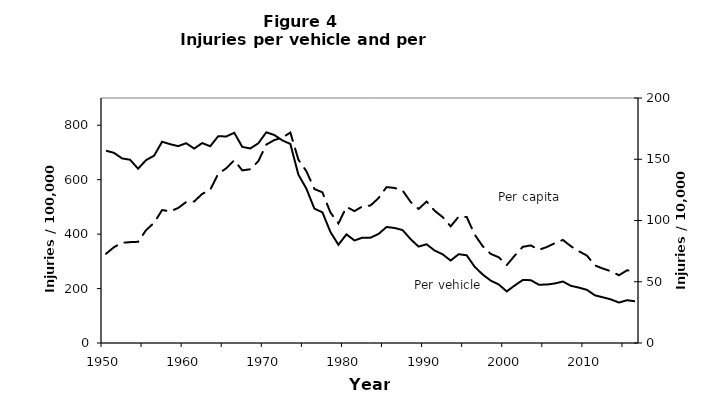
| Category | Series 0 |
|---|---|
| 1950.0 | 327.558 |
| 1951.0 | 352.1 |
| 1952.0 | 367.9 |
| 1953.0 | 370.5 |
| 1954.0 | 371.7 |
| 1955.0 | 414.6 |
| 1956.0 | 441.7 |
| 1957.0 | 488.5 |
| 1958.0 | 483.4 |
| 1959.0 | 496 |
| 1960.0 | 517.7 |
| 1961.0 | 519.9 |
| 1962.0 | 547.6 |
| 1963.0 | 562.8 |
| 1964.0 | 621.6 |
| 1965.0 | 641.7 |
| 1966.0 | 671 |
| 1967.0 | 634.2 |
| 1968.0 | 638.2 |
| 1969.0 | 667.8 |
| 1970.0 | 729 |
| 1971.0 | 745.5 |
| 1972.0 | 754 |
| 1973.0 | 773.1 |
| 1974.0 | 673.7 |
| 1975.0 | 631.1 |
| 1976.0 | 565.7 |
| 1977.0 | 553.5 |
| 1978.0 | 479.5 |
| 1979.0 | 439.4 |
| 1980.0 | 499.7 |
| 1981.0 | 484.6 |
| 1982.0 | 501.9 |
| 1983.0 | 505.1 |
| 1984.0 | 532.2 |
| 1985.0 | 572.6 |
| 1986.0 | 569.6 |
| 1987.0 | 560.4 |
| 1988.0 | 518.5 |
| 1989.0 | 492.4 |
| 1990.0 | 519.6 |
| 1991.0 | 486 |
| 1992.0 | 462.5 |
| 1993.0 | 428.6 |
| 1994.0 | 464.1 |
| 1995.0 | 463.1 |
| 1996.0 | 398 |
| 1997.0 | 355.6 |
| 1998.0 | 327.4 |
| 1999.0 | 314.9 |
| 2000.0 | 286.2 |
| 2001.0 | 321.2 |
| 2002.0 | 353.3 |
| 2003.0 | 358.5 |
| 2004.0 | 342 |
| 2005.0 | 352.6 |
| 2006.0 | 366.6 |
| 2007.0 | 378.7 |
| 2008.0 | 355.5 |
| 2009.0 | 336.9 |
| 2010.0 | 321.2 |
| 2011.0 | 285 |
| 2012.0 | 273.4 |
| 2013.0 | 263.5 |
| 2014.0 | 248.8 |
| 2015.0 | 266.9 |
| 2016.0 | 265.4 |